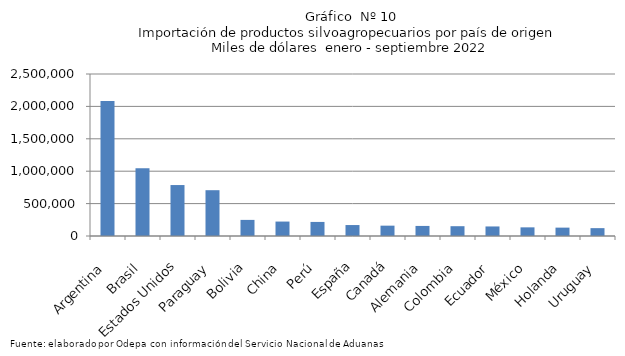
| Category | Series 0 |
|---|---|
| Argentina | 2084985.454 |
| Brasil | 1045447.438 |
| Estados Unidos | 786259.993 |
| Paraguay | 706879.469 |
| Bolivia | 248534.225 |
| China | 222792.649 |
| Perú | 217096.085 |
| España | 168991.01 |
| Canadá | 159625.014 |
| Alemania | 155392.858 |
| Colombia | 151270.185 |
| Ecuador | 147328.5 |
| México | 133484.393 |
| Holanda | 129182.144 |
| Uruguay | 121261.28 |